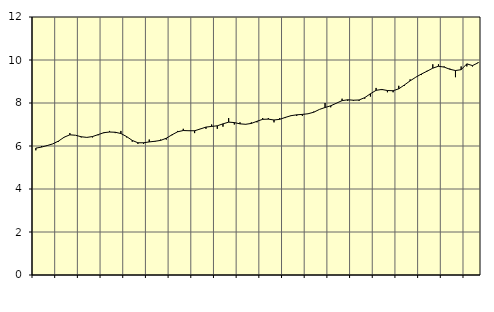
| Category | Piggar | Offentlig förvaltning m.m., SNI 84, 99 |
|---|---|---|
| nan | 5.8 | 5.9 |
| 1.0 | 6 | 5.95 |
| 1.0 | 6 | 6.02 |
| 1.0 | 6.1 | 6.1 |
| nan | 6.2 | 6.23 |
| 2.0 | 6.4 | 6.41 |
| 2.0 | 6.6 | 6.52 |
| 2.0 | 6.5 | 6.5 |
| nan | 6.4 | 6.43 |
| 3.0 | 6.4 | 6.4 |
| 3.0 | 6.4 | 6.44 |
| 3.0 | 6.5 | 6.53 |
| nan | 6.6 | 6.62 |
| 4.0 | 6.7 | 6.65 |
| 4.0 | 6.6 | 6.64 |
| 4.0 | 6.7 | 6.58 |
| nan | 6.4 | 6.44 |
| 5.0 | 6.2 | 6.26 |
| 5.0 | 6.1 | 6.15 |
| 5.0 | 6.1 | 6.15 |
| nan | 6.3 | 6.19 |
| 6.0 | 6.2 | 6.22 |
| 6.0 | 6.3 | 6.26 |
| 6.0 | 6.3 | 6.36 |
| nan | 6.5 | 6.52 |
| 7.0 | 6.7 | 6.66 |
| 7.0 | 6.8 | 6.72 |
| 7.0 | 6.7 | 6.71 |
| nan | 6.6 | 6.71 |
| 8.0 | 6.8 | 6.79 |
| 8.0 | 6.8 | 6.88 |
| 8.0 | 7 | 6.91 |
| nan | 6.8 | 6.94 |
| 9.0 | 6.9 | 7.03 |
| 9.0 | 7.3 | 7.11 |
| 9.0 | 7 | 7.09 |
| nan | 7.1 | 7.03 |
| 10.0 | 7 | 7.01 |
| 10.0 | 7.1 | 7.05 |
| 10.0 | 7.1 | 7.15 |
| nan | 7.3 | 7.24 |
| 11.0 | 7.3 | 7.25 |
| 11.0 | 7.1 | 7.21 |
| 11.0 | 7.3 | 7.24 |
| nan | 7.3 | 7.33 |
| 12.0 | 7.4 | 7.41 |
| 12.0 | 7.4 | 7.45 |
| 12.0 | 7.4 | 7.47 |
| nan | 7.5 | 7.5 |
| 13.0 | 7.6 | 7.57 |
| 13.0 | 7.7 | 7.7 |
| 13.0 | 8 | 7.79 |
| nan | 7.8 | 7.87 |
| 14.0 | 8 | 7.99 |
| 14.0 | 8.2 | 8.11 |
| 14.0 | 8.1 | 8.15 |
| nan | 8.1 | 8.13 |
| 15.0 | 8.1 | 8.14 |
| 15.0 | 8.2 | 8.25 |
| 15.0 | 8.3 | 8.43 |
| nan | 8.7 | 8.59 |
| 16.0 | 8.6 | 8.63 |
| 16.0 | 8.5 | 8.58 |
| 16.0 | 8.5 | 8.57 |
| nan | 8.8 | 8.66 |
| 17.0 | 8.8 | 8.84 |
| 17.0 | 9.1 | 9.03 |
| 17.0 | 9.2 | 9.2 |
| nan | 9.3 | 9.35 |
| 18.0 | 9.5 | 9.48 |
| 18.0 | 9.8 | 9.62 |
| 18.0 | 9.8 | 9.71 |
| nan | 9.7 | 9.67 |
| 19.0 | 9.6 | 9.57 |
| 19.0 | 9.2 | 9.51 |
| 19.0 | 9.7 | 9.55 |
| nan | 9.7 | 9.82 |
| 20.0 | 9.7 | 9.74 |
| 20.0 | 9.9 | 9.87 |